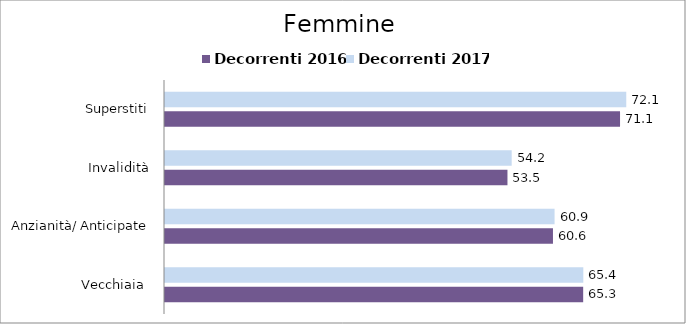
| Category | Decorrenti 2016 | Decorrenti 2017 |
|---|---|---|
| Vecchiaia  | 65.34 | 65.36 |
| Anzianità/ Anticipate | 60.62 | 60.87 |
| Invalidità | 53.51 | 54.17 |
| Superstiti | 71.1 | 72.07 |